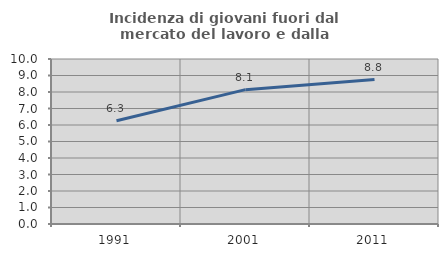
| Category | Incidenza di giovani fuori dal mercato del lavoro e dalla formazione  |
|---|---|
| 1991.0 | 6.26 |
| 2001.0 | 8.142 |
| 2011.0 | 8.756 |